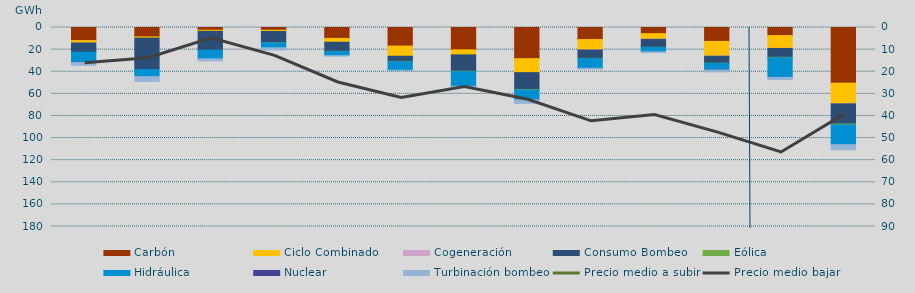
| Category | Carbón | Ciclo Combinado | Cogeneración | Consumo Bombeo | Eólica | Hidráulica | Nuclear | Turbinación bombeo |
|---|---|---|---|---|---|---|---|---|
| 0 | 11885.7 | 2095.2 | 0 | 8367.7 | 0 | 9252.1 | 90 | 2538.1 |
| 1 | 8482.9 | 1097 | 0 | 28368.3 | 0 | 6471.7 | 0 | 4284.6 |
| 2 | 2481.2 | 973 | 0 | 16964.8 | 0 | 7876.1 | 0 | 1848.7 |
| 3 | 2502.1 | 1126 | 0 | 10105.8 | 176.9 | 4467.7 | 0 | 1975.3 |
| 4 | 9826.3 | 3497.3 | 0 | 8231.5 | 242 | 3677.4 | 0 | 129.8 |
| 5 | 16804.9 | 9200.1 | 0 | 4654.1 | 369.5 | 7625.8 | 0 | 107.2 |
| 6 | 20254.1 | 4502.5 | 0 | 14825.7 | 422.9 | 13215.2 | 0 | 462.9 |
| 7 | 28176.4 | 12664.3 | 0 | 15166.3 | 462.1 | 8996.5 | 0 | 3124.7 |
| 8 | 10892.6 | 9459.3 | 19 | 7585 | 201.8 | 8745.3 | 0 | 691.6 |
| 9 | 5563.5 | 5060.2 | 113 | 7129.2 | 169.4 | 3964.2 | 0 | 709 |
| 10 | 12581.1 | 13203.9 | 233 | 6261.8 | 220.5 | 5846.4 | 125 | 1688.7 |
| 11 | 7306.9 | 11559.1 | 88 | 7999 | 402.8 | 17797.7 | 0 | 1941.3 |
| 12 | 50376 | 18600.8 | 92.8 | 18257.2 | 867.9 | 17793.5 | 0 | 4596.7 |